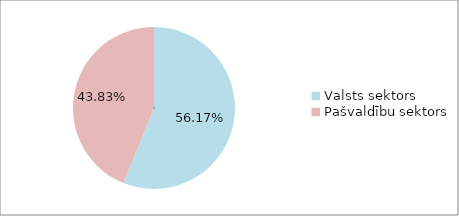
| Category | Series 0 |
|---|---|
| Valsts sektors | 0.562 |
| Pašvaldību sektors | 0.438 |